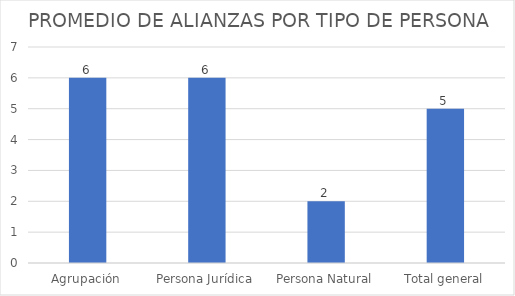
| Category | PROMEDIO |
|---|---|
| Agrupación | 6 |
| Persona Jurídica | 6 |
| Persona Natural | 2 |
| Total general | 5 |